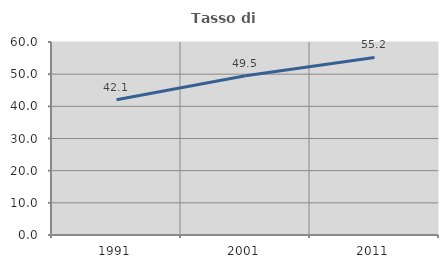
| Category | Tasso di occupazione   |
|---|---|
| 1991.0 | 42.054 |
| 2001.0 | 49.485 |
| 2011.0 | 55.211 |